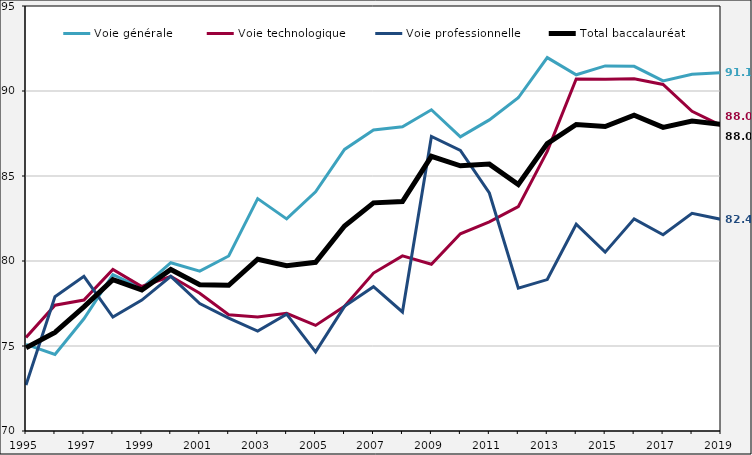
| Category | Voie générale  | Voie technologique | Voie professionnelle | Total baccalauréat |
|---|---|---|---|---|
| 1995 | 75.1 | 75.5 | 72.7 | 74.9 |
| 1996 | 74.5 | 77.4 | 77.9 | 75.8 |
| 1997 | 76.6 | 77.7 | 79.1 | 77.3 |
| 1998 | 79.2 | 79.5 | 76.7 | 78.9 |
| 1999 | 78.4 | 78.5 | 77.7 | 78.3 |
| 2000 | 79.9 | 79.1 | 79.1 | 79.5 |
| 2001 | 79.4 | 78.1 | 77.5 | 78.6 |
| 2002 | 80.297 | 76.838 | 76.645 | 78.57 |
| 2003 | 83.669 | 76.703 | 75.876 | 80.104 |
| 2004 | 82.477 | 76.92 | 76.873 | 79.725 |
| 2005 | 84.065 | 76.211 | 74.657 | 79.921 |
| 2006 | 86.566 | 77.333 | 77.333 | 82.056 |
| 2007 | 87.704 | 79.291 | 78.487 | 83.419 |
| 2008 | 87.9 | 80.3 | 77 | 83.5 |
| 2009 | 88.898 | 79.81 | 87.33 | 86.156 |
| 2010 | 87.3 | 81.6 | 86.5 | 85.6 |
| 2011 | 88.3 | 82.3 | 84 | 85.7 |
| 2012 | 89.6 | 83.2 | 78.4 | 84.5 |
| 2013 | 91.964 | 86.452 | 78.908 | 86.906 |
| 2014 | 90.953 | 90.702 | 82.162 | 88.031 |
| 2015 | 91.477 | 90.699 | 80.522 | 87.91 |
| 2016 | 91.452 | 90.724 | 82.48 | 88.575 |
| 2017 | 90.592 | 90.385 | 81.546 | 87.863 |
| 2018 | 90.979 | 88.808 | 82.806 | 88.233 |
| 2019 | 91.084 | 87.969 | 82.45 | 88.043 |